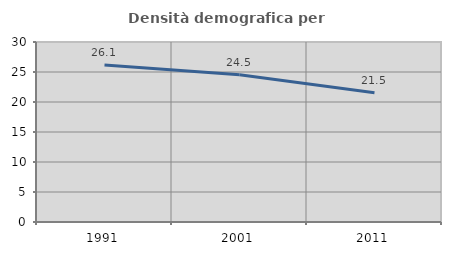
| Category | Densità demografica |
|---|---|
| 1991.0 | 26.15 |
| 2001.0 | 24.537 |
| 2011.0 | 21.542 |